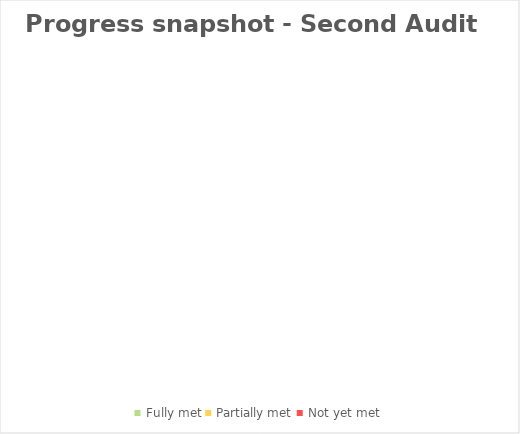
| Category | Term 2 |
|---|---|
| Fully met | 0 |
| Partially met | 0 |
| Not yet met | 0 |